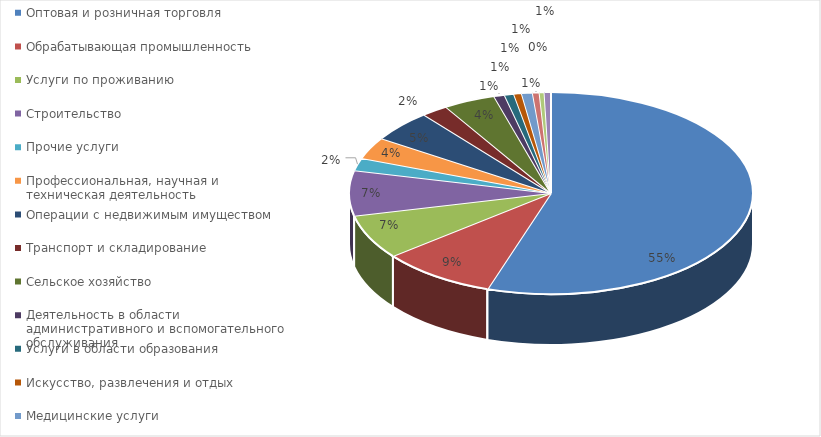
| Category | Series 0 |
|---|---|
| Оптовая и розничная торговля | 0.551 |
| Обрабатывающая промышленность | 0.092 |
| Услуги по проживанию | 0.071 |
| Строительство | 0.072 |
| Прочие услуги | 0.02 |
| Профессиональная, научная и техническая деятельность | 0.035 |
| Операции с недвижимым имуществом | 0.05 |
| Транспорт и складирование | 0.021 |
| Сельское хозяйство | 0.042 |
| Деятельность в области административного и вспомогательного обслуживания | 0.009 |
| Услуги в области образования | 0.007 |
| Искусство, развлечения и отдых | 0.006 |
| Медицинские услуги | 0.009 |
| Информация и связь | 0.005 |
| Водоснабжение; сбор, обработка и удаление отходов | 0.004 |
| Электроснабжение, подача газа, пара и воздушное кондиционирование | 0.005 |